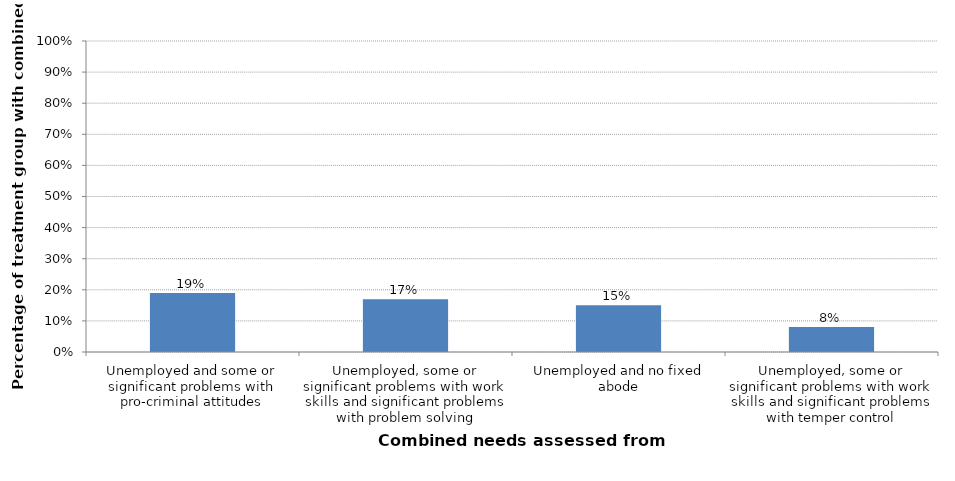
| Category | Percentage of treatment group with combined need |
|---|---|
| Unemployed and some or significant problems with pro-criminal attitudes | 0.19 |
| Unemployed, some or significant problems with work skills and significant problems with problem solving | 0.17 |
| Unemployed and no fixed abode | 0.15 |
| Unemployed, some or significant problems with work skills and significant problems with temper control | 0.08 |